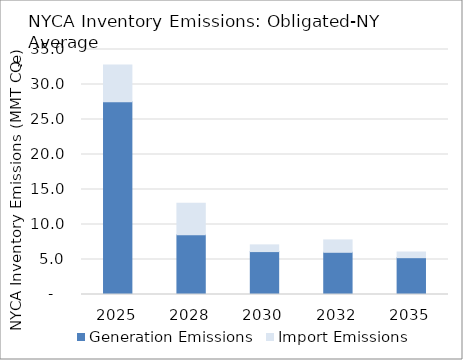
| Category | Generation Emissions  | Import Emissions |
|---|---|---|
| 2025.0 | 27.52 | 5.28 |
| 2028.0 | 8.52 | 4.53 |
| 2030.0 | 6.13 | 0.96 |
| 2032.0 | 6.03 | 1.77 |
| 2035.0 | 5.26 | 0.81 |